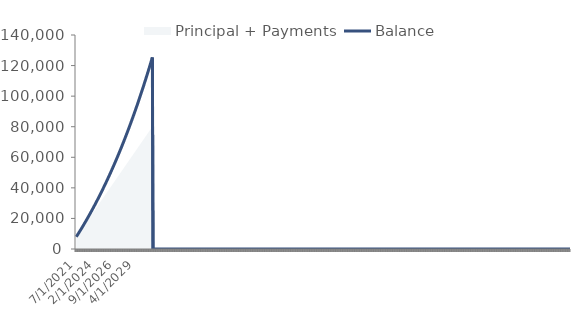
| Category | Balance |
|---|---|
| 01.07.2021 | 8000 |
| 01.08.2021 | 8651.472 |
| 01.09.2021 | 9307.136 |
| 01.10.2021 | 9967.018 |
| 01.11.2021 | 10631.147 |
| 01.12.2021 | 11299.548 |
| 01.01.2022 | 11972.249 |
| 01.02.2022 | 12649.279 |
| 01.03.2022 | 13330.665 |
| 01.04.2022 | 14016.435 |
| 01.05.2022 | 14706.617 |
| 01.06.2022 | 15401.24 |
| 01.07.2022 | 16100.332 |
| 01.08.2022 | 16803.922 |
| 01.09.2022 | 17512.039 |
| 01.10.2022 | 18224.712 |
| 01.11.2022 | 18941.97 |
| 01.12.2022 | 19663.843 |
| 01.01.2023 | 20390.361 |
| 01.02.2023 | 21121.553 |
| 01.03.2023 | 21857.45 |
| 01.04.2023 | 22598.082 |
| 01.05.2023 | 23343.478 |
| 01.06.2023 | 24093.671 |
| 01.07.2023 | 24848.69 |
| 01.08.2023 | 25608.568 |
| 01.09.2023 | 26373.334 |
| 01.10.2023 | 27143.021 |
| 01.11.2023 | 27917.66 |
| 01.12.2023 | 28697.283 |
| 01.01.2024 | 29481.922 |
| 01.02.2024 | 30271.609 |
| 01.03.2024 | 31066.378 |
| 01.04.2024 | 31866.26 |
| 01.05.2024 | 32671.288 |
| 01.06.2024 | 33481.496 |
| 01.07.2024 | 34296.917 |
| 01.08.2024 | 35117.585 |
| 01.09.2024 | 35943.532 |
| 01.10.2024 | 36774.794 |
| 01.11.2024 | 37611.404 |
| 01.12.2024 | 38453.397 |
| 01.01.2025 | 39300.808 |
| 01.02.2025 | 40153.67 |
| 01.03.2025 | 41012.02 |
| 01.04.2025 | 41875.893 |
| 01.05.2025 | 42745.323 |
| 01.06.2025 | 43620.348 |
| 01.07.2025 | 44501.003 |
| 01.08.2025 | 45387.324 |
| 01.09.2025 | 46279.347 |
| 01.10.2025 | 47177.11 |
| 01.11.2025 | 48080.649 |
| 01.12.2025 | 48990.001 |
| 01.01.2026 | 49905.204 |
| 01.02.2026 | 50826.296 |
| 01.03.2026 | 51753.314 |
| 01.04.2026 | 52686.296 |
| 01.05.2026 | 53625.281 |
| 01.06.2026 | 54570.308 |
| 01.07.2026 | 55521.415 |
| 01.08.2026 | 56478.641 |
| 01.09.2026 | 57442.027 |
| 01.10.2026 | 58411.61 |
| 01.11.2026 | 59387.432 |
| 01.12.2026 | 60369.533 |
| 01.01.2027 | 61357.952 |
| 01.02.2027 | 62352.731 |
| 01.03.2027 | 63353.911 |
| 01.04.2027 | 64361.532 |
| 01.05.2027 | 65375.636 |
| 01.06.2027 | 66396.264 |
| 01.07.2027 | 67423.46 |
| 01.08.2027 | 68457.264 |
| 01.09.2027 | 69497.721 |
| 01.10.2027 | 70544.871 |
| 01.11.2027 | 71598.759 |
| 01.12.2027 | 72659.427 |
| 01.01.2028 | 73726.92 |
| 01.02.2028 | 74801.282 |
| 01.03.2028 | 75882.555 |
| 01.04.2028 | 76970.786 |
| 01.05.2028 | 78066.018 |
| 01.06.2028 | 79168.297 |
| 01.07.2028 | 80277.669 |
| 01.08.2028 | 81394.178 |
| 01.09.2028 | 82517.87 |
| 01.10.2028 | 83648.793 |
| 01.11.2028 | 84786.991 |
| 01.12.2028 | 85932.513 |
| 01.01.2029 | 87085.406 |
| 01.02.2029 | 88245.716 |
| 01.03.2029 | 89413.492 |
| 01.04.2029 | 90588.781 |
| 01.05.2029 | 91771.632 |
| 01.06.2029 | 92962.093 |
| 01.07.2029 | 94160.214 |
| 01.08.2029 | 95366.044 |
| 01.09.2029 | 96579.632 |
| 01.10.2029 | 97801.028 |
| 01.11.2029 | 99030.283 |
| 01.12.2029 | 100267.446 |
| 01.01.2030 | 101512.57 |
| 01.02.2030 | 102765.705 |
| 01.03.2030 | 104026.903 |
| 01.04.2030 | 105296.215 |
| 01.05.2030 | 106573.694 |
| 01.06.2030 | 107859.392 |
| 01.07.2030 | 109153.363 |
| 01.08.2030 | 110455.659 |
| 01.09.2030 | 111766.334 |
| 01.10.2030 | 113085.442 |
| 01.11.2030 | 114413.037 |
| 01.12.2030 | 115749.174 |
| 01.01.2031 | 117093.908 |
| 01.02.2031 | 118447.293 |
| 01.03.2031 | 119809.387 |
| 01.04.2031 | 121180.244 |
| 01.05.2031 | 122559.921 |
| 01.06.2031 | 123948.476 |
| 01.07.2031 | 125345.964 |